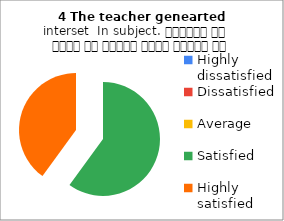
| Category | 4 The teacher genearted interset  In subject. शिक्षक ने विषय के प्रति रुचि जागृत की |
|---|---|
| Highly dissatisfied | 0 |
| Dissatisfied | 0 |
| Average | 0 |
| Satisfied | 3 |
| Highly satisfied | 2 |